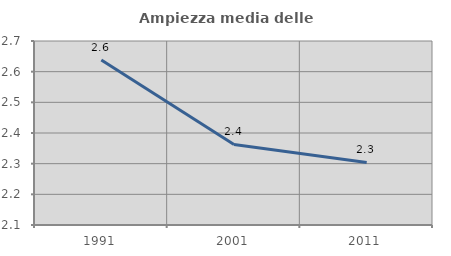
| Category | Ampiezza media delle famiglie |
|---|---|
| 1991.0 | 2.638 |
| 2001.0 | 2.363 |
| 2011.0 | 2.304 |